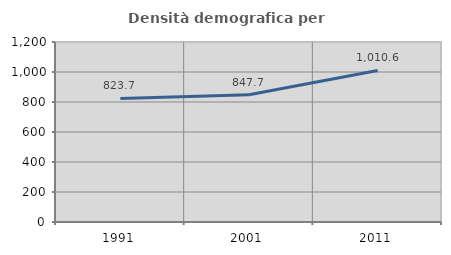
| Category | Densità demografica |
|---|---|
| 1991.0 | 823.736 |
| 2001.0 | 847.702 |
| 2011.0 | 1010.585 |